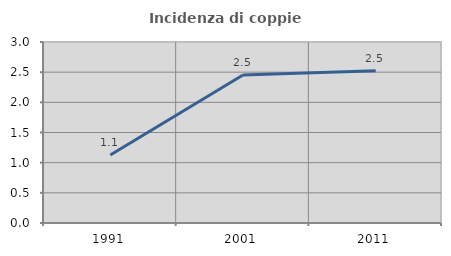
| Category | Incidenza di coppie miste |
|---|---|
| 1991.0 | 1.127 |
| 2001.0 | 2.454 |
| 2011.0 | 2.525 |